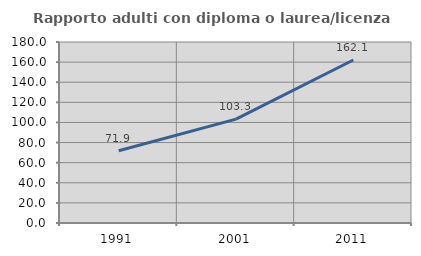
| Category | Rapporto adulti con diploma o laurea/licenza media  |
|---|---|
| 1991.0 | 71.854 |
| 2001.0 | 103.276 |
| 2011.0 | 162.129 |